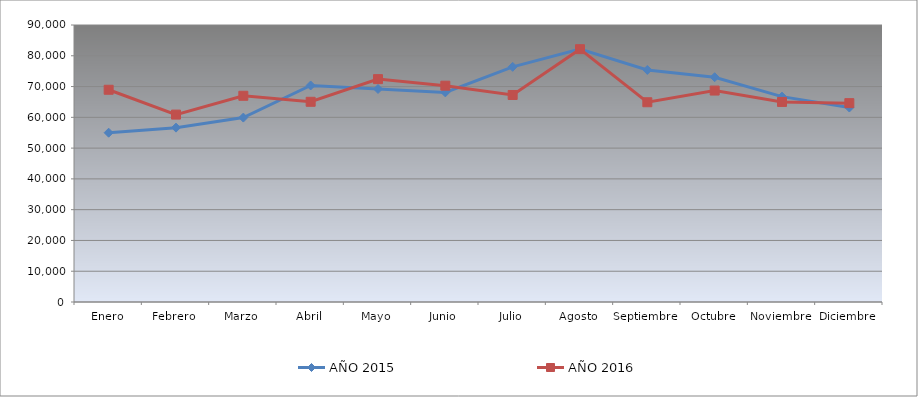
| Category | AÑO 2015 | AÑO 2016 |
|---|---|---|
| Enero | 55009.683 | 68961.413 |
| Febrero | 56651.182 | 60891.207 |
| Marzo | 59916.242 | 67005.631 |
| Abril | 70354.268 | 65049.848 |
| Mayo | 69206.115 | 72414.544 |
| Junio | 68105.802 | 70283.128 |
| Julio | 76405.991 | 67264.615 |
| Agosto | 82194.596 | 82142.848 |
| Septiembre | 75401.357 | 64901.007 |
| Octubre | 73039.272 | 68699.451 |
| Noviembre | 66730.411 | 65002.219 |
| Diciembre | 63184.292 | 64615.23 |